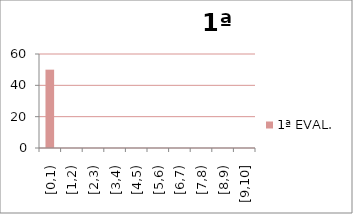
| Category | 1ª EVAL. |
|---|---|
| [0,1) | 50 |
| [1,2) | 0 |
| [2,3) | 0 |
| [3,4) | 0 |
| [4,5) | 0 |
| [5,6) | 0 |
| [6,7) | 0 |
| [7,8) | 0 |
| [8,9) | 0 |
| [9,10] | 0 |